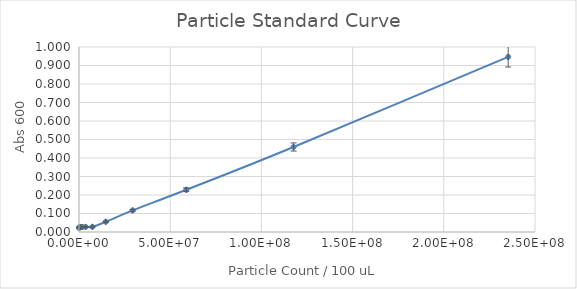
| Category | Series 0 |
|---|---|
| 235294117.64705887 | 0.946 |
| 117647058.82352944 | 0.46 |
| 58823529.41176472 | 0.228 |
| 29411764.70588236 | 0.117 |
| 14705882.35294118 | 0.055 |
| 7352941.17647059 | 0.028 |
| 3676470.588235295 | 0.028 |
| 1838235.2941176475 | 0.027 |
| 919117.6470588237 | 0.026 |
| 459558.82352941186 | 0.027 |
| 229779.41176470593 | 0.025 |
| 0.0 | 0.022 |